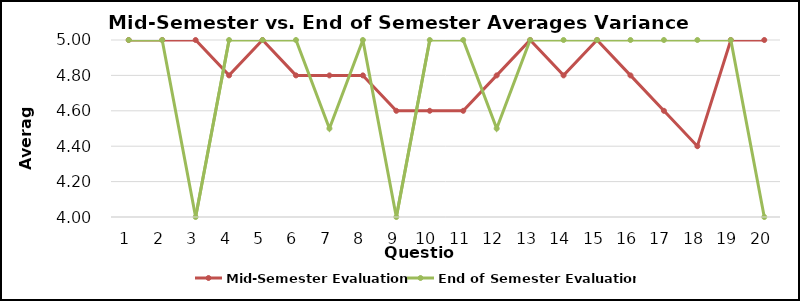
| Category | Mid-Semester Evaluation | End of Semester Evaluation |
|---|---|---|
| 0 | 5 | 5 |
| 1 | 5 | 5 |
| 2 | 5 | 4 |
| 3 | 4.8 | 5 |
| 4 | 5 | 5 |
| 5 | 4.8 | 5 |
| 6 | 4.8 | 4.5 |
| 7 | 4.8 | 5 |
| 8 | 4.6 | 4 |
| 9 | 4.6 | 5 |
| 10 | 4.6 | 5 |
| 11 | 4.8 | 4.5 |
| 12 | 5 | 5 |
| 13 | 4.8 | 5 |
| 14 | 5 | 5 |
| 15 | 4.8 | 5 |
| 16 | 4.6 | 5 |
| 17 | 4.4 | 5 |
| 18 | 5 | 5 |
| 19 | 5 | 4 |